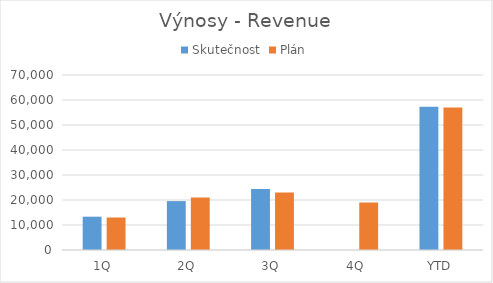
| Category | Skutečnost | Plán |
|---|---|---|
| 1Q | 13326 | 13000 |
| 2Q | 19564 | 21000 |
| 3Q | 24431 | 23000 |
| 4Q | 0 | 19000 |
| YTD | 57321 | 57000 |